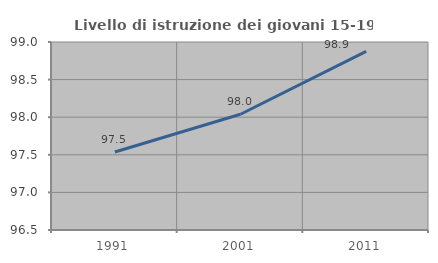
| Category | Livello di istruzione dei giovani 15-19 anni |
|---|---|
| 1991.0 | 97.537 |
| 2001.0 | 98.039 |
| 2011.0 | 98.876 |